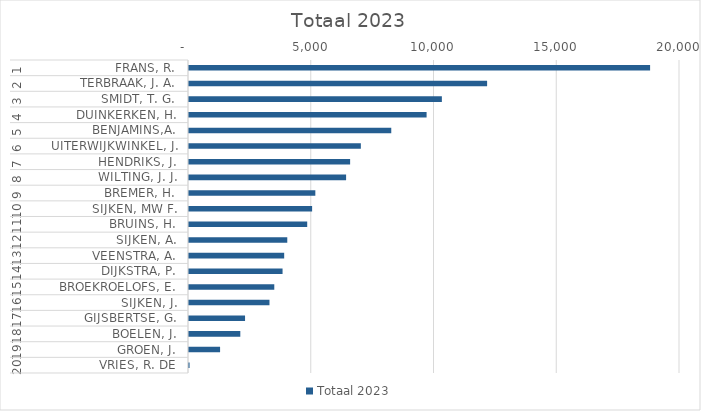
| Category | Totaal 2023 |
|---|---|
| 0 | 18782 |
| 1 | 12143 |
| 2 | 10300 |
| 3 | 9678 |
| 4 | 8239 |
| 5 | 7000 |
| 6 | 6563 |
| 7 | 6399 |
| 8 | 5146 |
| 9 | 5015 |
| 10 | 4815 |
| 11 | 4003 |
| 12 | 3877 |
| 13 | 3811 |
| 14 | 3474 |
| 15 | 3278 |
| 16 | 2283 |
| 17 | 2090 |
| 18 | 1266 |
| 19 | 23 |